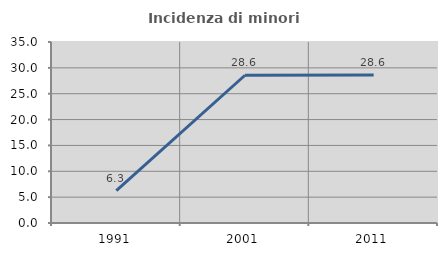
| Category | Incidenza di minori stranieri |
|---|---|
| 1991.0 | 6.25 |
| 2001.0 | 28.571 |
| 2011.0 | 28.638 |